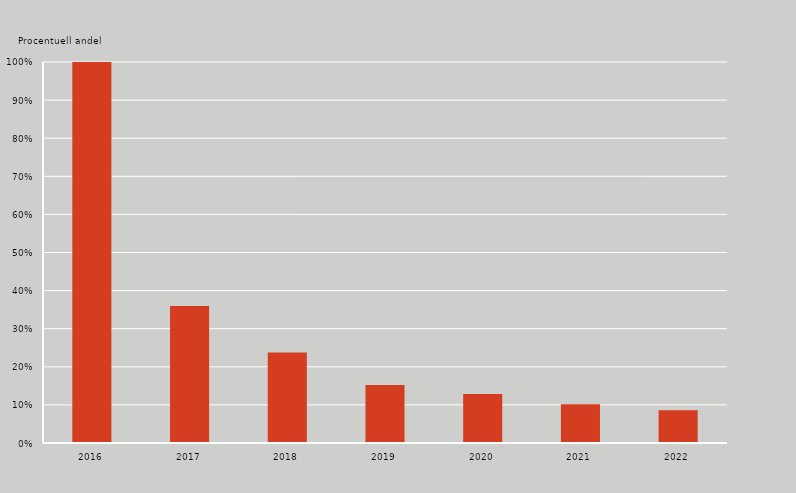
| Category | Series 0 |
|---|---|
| 2016.0 | 1 |
| 2017.0 | 0.36 |
| 2018.0 | 0.237 |
| 2019.0 | 0.152 |
| 2020.0 | 0.129 |
| 2021.0 | 0.102 |
| 2022.0 | 0.086 |